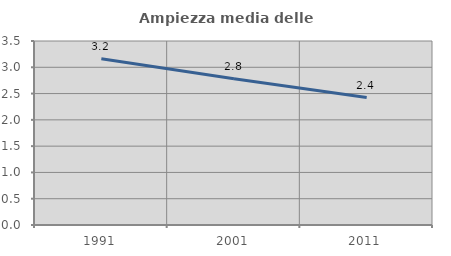
| Category | Ampiezza media delle famiglie |
|---|---|
| 1991.0 | 3.161 |
| 2001.0 | 2.783 |
| 2011.0 | 2.425 |